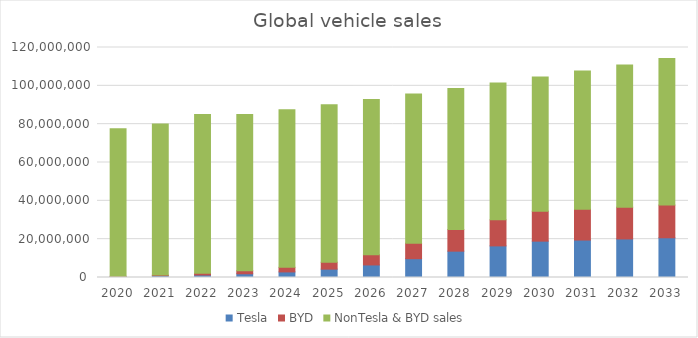
| Category | Tesla | BYD | NonTesla & BYD sales |
|---|---|---|---|
| 2020.0 | 499647 | 133000 | 76988935 |
| 2021.0 | 936222 | 325000 | 78884766 |
| 2022.0 | 1313851 | 910000 | 82792877 |
| 2023.0 | 1939015 | 1597000 | 81480713 |
| 2024.0 | 2908522.5 | 2395500 | 82263207.34 |
| 2025.0 | 4362783.75 | 3593250 | 82238212.985 |
| 2026.0 | 6544175.625 | 5389875 | 80966023.512 |
| 2027.0 | 9816263.438 | 8084812.5 | 77786000.424 |
| 2028.0 | 13742768.812 | 11318737.5 | 73496182.34 |
| 2029.0 | 16491322.575 | 13582485 | 71440611.737 |
| 2030.0 | 18965020.961 | 15619857.75 | 69974973.18 |
| 2031.0 | 19533971.59 | 16088453.482 | 72074222.375 |
| 2032.0 | 20119990.738 | 16571107.087 | 74236449.047 |
| 2033.0 | 20723590.46 | 17068240.3 | 76463542.518 |